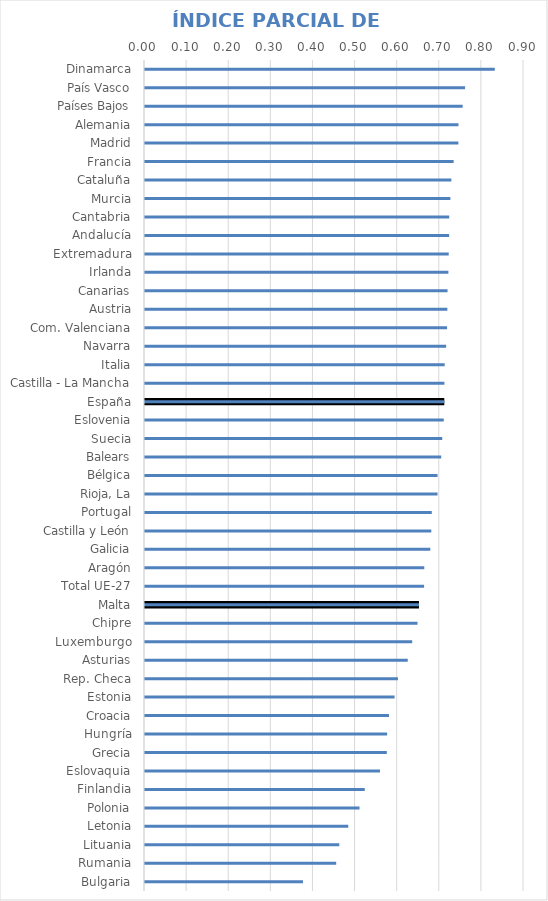
| Category | VIDA |
|---|---|
| Dinamarca | 0.833 |
| País Vasco | 0.762 |
| Países Bajos | 0.757 |
| Alemania | 0.747 |
| Madrid | 0.747 |
| Francia | 0.735 |
| Cataluña | 0.73 |
| Murcia | 0.728 |
| Cantabria | 0.725 |
| Andalucía | 0.725 |
| Extremadura | 0.724 |
| Irlanda | 0.723 |
| Canarias | 0.721 |
| Austria | 0.72 |
| Com. Valenciana | 0.72 |
| Navarra | 0.717 |
| Italia | 0.714 |
| Castilla - La Mancha | 0.713 |
| España | 0.713 |
| Eslovenia | 0.712 |
| Suecia | 0.708 |
| Balears | 0.706 |
| Bélgica | 0.697 |
| Rioja, La | 0.697 |
| Portugal | 0.683 |
| Castilla y León | 0.682 |
| Galicia | 0.68 |
| Aragón | 0.666 |
| Total UE-27 | 0.665 |
| Malta | 0.653 |
| Chipre | 0.649 |
| Luxemburgo | 0.637 |
| Asturias | 0.626 |
| Rep. Checa | 0.603 |
| Estonia | 0.595 |
| Croacia | 0.582 |
| Hungría | 0.577 |
| Grecia | 0.577 |
| Eslovaquia | 0.56 |
| Finlandia | 0.524 |
| Polonia | 0.512 |
| Letonia | 0.485 |
| Lituania | 0.464 |
| Rumania | 0.456 |
| Bulgaria | 0.378 |